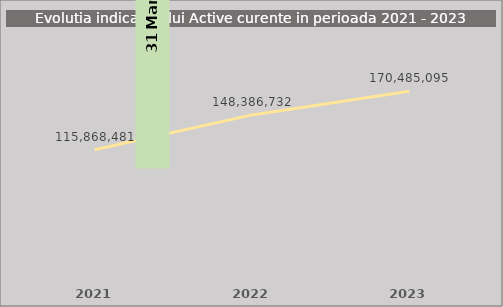
| Category | Series 0 |
|---|---|
| 2021.0 | 115868481.383 |
| 2022.0 | 148386732.486 |
| 2023.0 | 170485095.268 |